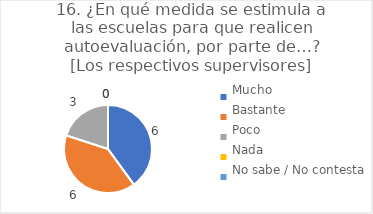
| Category | 16. ¿En qué medida se estimula a las escuelas para que realicen autoevaluación, por parte de…?
[Los respectivos supervisores] |
|---|---|
| Mucho  | 0.4 |
| Bastante  | 0.4 |
| Poco  | 0.2 |
| Nada  | 0 |
| No sabe / No contesta | 0 |